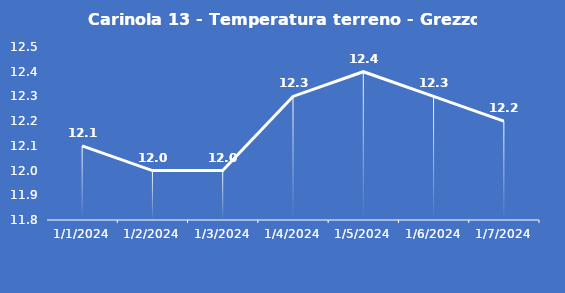
| Category | Carinola 13 - Temperatura terreno - Grezzo (°C) |
|---|---|
| 1/1/24 | 12.1 |
| 1/2/24 | 12 |
| 1/3/24 | 12 |
| 1/4/24 | 12.3 |
| 1/5/24 | 12.4 |
| 1/6/24 | 12.3 |
| 1/7/24 | 12.2 |